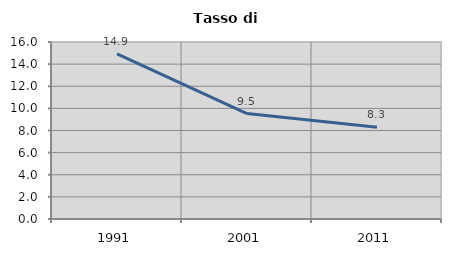
| Category | Tasso di disoccupazione   |
|---|---|
| 1991.0 | 14.921 |
| 2001.0 | 9.534 |
| 2011.0 | 8.285 |